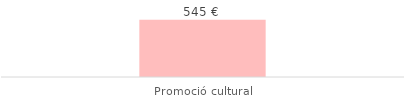
| Category | Total |
|---|---|
| Promoció cultural | 544.5 |